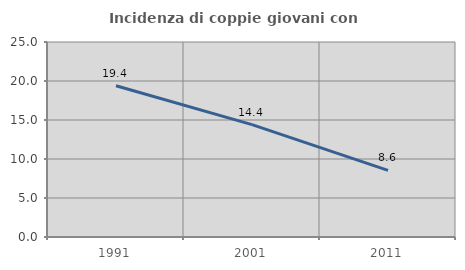
| Category | Incidenza di coppie giovani con figli |
|---|---|
| 1991.0 | 19.393 |
| 2001.0 | 14.405 |
| 2011.0 | 8.551 |